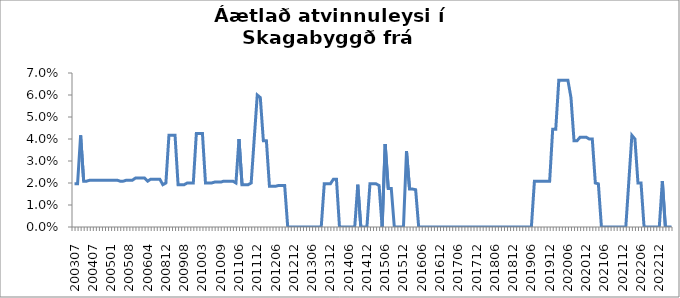
| Category | Series 0 |
|---|---|
| 200307 | 0.02 |
| 200309 | 0.02 |
| 200310 | 0.042 |
| 200311 | 0.021 |
| 200312 | 0.021 |
| 200402 | 0.021 |
| 200407 | 0.021 |
| 200408 | 0.021 |
| 200409 | 0.021 |
| 200410 | 0.021 |
| 200411 | 0.021 |
| 200412 | 0.021 |
| 200501 | 0.021 |
| 200502 | 0.021 |
| 200503 | 0.021 |
| 200505 | 0.021 |
| 200506 | 0.021 |
| 200507 | 0.021 |
| 200508 | 0.021 |
| 200509 | 0.021 |
| 200510 | 0.022 |
| 200511 | 0.022 |
| 200602 | 0.022 |
| 200603 | 0.022 |
| 200604 | 0.021 |
| 200610 | 0.022 |
| 200611 | 0.022 |
| 200701 | 0.022 |
| 200702 | 0.022 |
| 200703 | 0.019 |
| 200812 | 0.02 |
| 200901 | 0.042 |
| 200902 | 0.042 |
| 200903 | 0.042 |
| 200904 | 0.019 |
| 200907 | 0.019 |
| 200908 | 0.019 |
| 200910 | 0.02 |
| 200911 | 0.02 |
| 200912 | 0.02 |
| 201001 | 0.043 |
| 201002 | 0.043 |
| 201003 | 0.043 |
| 201004 | 0.02 |
| 201005 | 0.02 |
| 201006 | 0.02 |
| 201007 | 0.02 |
| 201008 | 0.02 |
| 201009 | 0.02 |
| 201010 | 0.021 |
| 201011 | 0.021 |
| 201012 | 0.021 |
| 201101 | 0.021 |
| 201105 | 0.02 |
| 201106 | 0.04 |
| 201107 | 0.019 |
| 201108 | 0.019 |
| 201109 | 0.019 |
| 201110 | 0.02 |
| 201111 | 0.04 |
| 201112 | 0.06 |
| 201201 | 0.059 |
| 201202 | 0.039 |
| 201203 | 0.039 |
| 201204 | 0.019 |
| 201205 | 0.019 |
| 201206 | 0.019 |
| 201207 | 0.019 |
| 201208 | 0.019 |
| 201209 | 0.019 |
| 201210 | 0 |
| 201211 | 0 |
| 201212 | 0 |
| 201301 | 0 |
| 201302 | 0 |
| 201303 | 0 |
| 201304 | 0 |
| 201305 | 0 |
| 201306 | 0 |
| 201307 | 0 |
| 201308 | 0 |
| 201309 | 0 |
| 201310 | 0.02 |
| 201311 | 0.02 |
| 201312 | 0.02 |
| 201401 | 0.022 |
| 201402 | 0.022 |
| 201403 | 0 |
| 201404 | 0 |
| 201405 | 0 |
| 201406 | 0 |
| 201407 | 0 |
| 201408 | 0 |
| 201409 | 0.019 |
| 201410 | 0 |
| 201411 | 0 |
| 201412 | 0 |
| 201501 | 0.02 |
| 201502 | 0.02 |
| 201503 | 0.02 |
| 201504 | 0.019 |
| 201505 | 0 |
| 201506 | 0.038 |
| 201507 | 0.018 |
| 201508 | 0.018 |
| 201509 | 0 |
| 201510 | 0 |
| 201511 | 0 |
| 201512 | 0 |
| 201601 | 0.034 |
| 201602 | 0.017 |
| 201603 | 0.017 |
| 201604 | 0.017 |
| 201605 | 0 |
| 201606 | 0 |
| 201607 | 0 |
| 201608 | 0 |
| 201609 | 0 |
| 201610 | 0 |
| 201611 | 0 |
| 201612 | 0 |
| 201701 | 0 |
| 201702 | 0 |
| 201703 | 0 |
| 201704 | 0 |
| 201705 | 0 |
| 201706 | 0 |
| 201707 | 0 |
| 201708 | 0 |
| 201709 | 0 |
| 201710 | 0 |
| 201711 | 0 |
| 201712 | 0 |
| 201801 | 0 |
| 201802 | 0 |
| 201803 | 0 |
| 201804 | 0 |
| 201805 | 0 |
| 201806 | 0 |
| 201807 | 0 |
| 201808 | 0 |
| 201809 | 0 |
| 201810 | 0 |
| 201811 | 0 |
| 201812 | 0 |
| 201901 | 0 |
| 201902 | 0 |
| 201903 | 0 |
| 201904 | 0 |
| 201905 | 0 |
| 201906 | 0 |
| 201907 | 0.021 |
| 201908 | 0.021 |
| 201909 | 0.021 |
| 201910 | 0.021 |
| 201911 | 0.021 |
| 201912 | 0.021 |
| 202001 | 0.044 |
| 202002 | 0.044 |
| 202003 | 0.067 |
| 202004 | 0.067 |
| 202005 | 0.067 |
| 202006 | 0.067 |
| 202007 | 0.059 |
| 202008 | 0.039 |
| 202009 | 0.039 |
| 202010 | 0.041 |
| 202011 | 0.041 |
| 202012 | 0.041 |
| 202101 | 0.04 |
| 202102 | 0.04 |
| 202103 | 0.02 |
| 202104 | 0.02 |
| 202105 | 0 |
| 202106 | 0 |
| 202107 | 0 |
| 202108 | 0 |
| 202109 | 0 |
| 202110 | 0 |
| 202111 | 0 |
| 202112 | 0 |
| 202201 | 0 |
| 202202 | 0.021 |
| 202203 | 0.042 |
| 202204 | 0.04 |
| 202205 | 0.02 |
| 202206 | 0.02 |
| 202207 | 0 |
| 202208 | 0 |
| 202209 | 0 |
| 202210 | 0 |
| 202211 | 0 |
| 202212 | 0 |
| 202301 | 0.021 |
| 202302 | 0 |
| 202303 | 0 |
| 202304 | 0 |